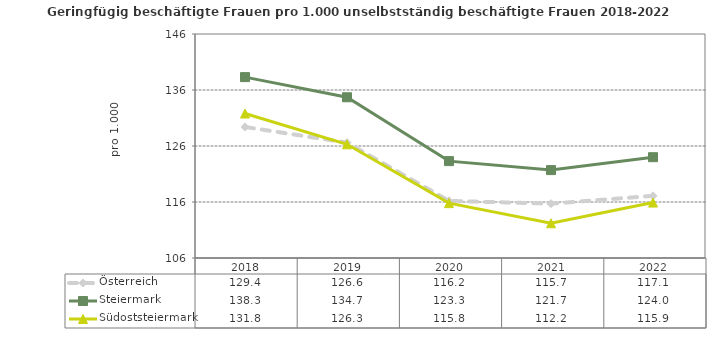
| Category | Österreich | Steiermark | Südoststeiermark |
|---|---|---|---|
| 2022.0 | 117.1 | 124 | 115.9 |
| 2021.0 | 115.7 | 121.7 | 112.2 |
| 2020.0 | 116.2 | 123.3 | 115.8 |
| 2019.0 | 126.6 | 134.7 | 126.3 |
| 2018.0 | 129.4 | 138.3 | 131.8 |